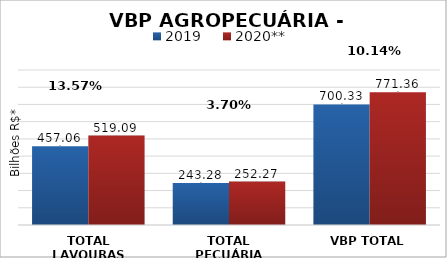
| Category | 2019 | 2020** |
|---|---|---|
| TOTAL LAVOURAS | 457.057 | 519.086 |
| TOTAL PECUÁRIA | 243.276 | 252.273 |
| VBP TOTAL | 700.333 | 771.359 |